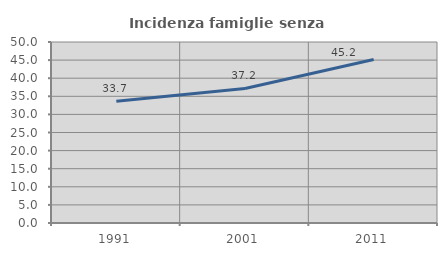
| Category | Incidenza famiglie senza nuclei |
|---|---|
| 1991.0 | 33.663 |
| 2001.0 | 37.167 |
| 2011.0 | 45.181 |